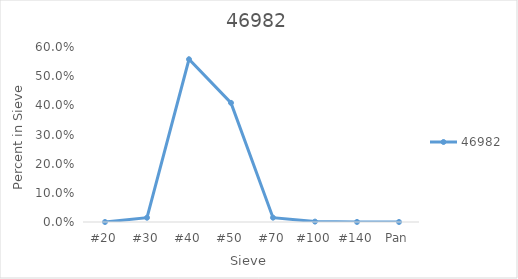
| Category | 46982 |
|---|---|
| #20 | 0 |
| #30 | 0.015 |
| #40 | 0.558 |
| #50 | 0.408 |
| #70 | 0.015 |
| #100 | 0.001 |
| #140 | 0 |
| Pan | 0 |